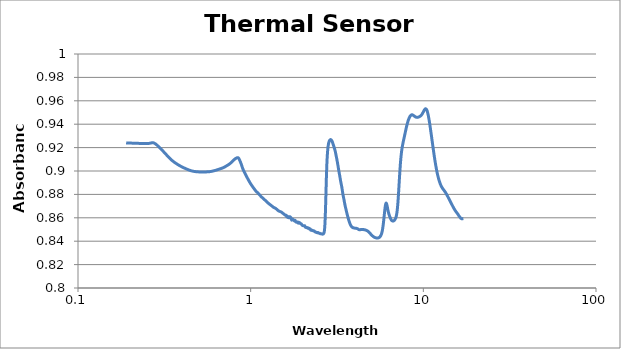
| Category | Absorbance |
|---|---|
| 0.19 | 0.924 |
| 0.25 | 0.923 |
| 0.275 | 0.924 |
| 0.3 | 0.919 |
| 0.325 | 0.914 |
| 0.35 | 0.909 |
| 0.375 | 0.906 |
| 0.4 | 0.904 |
| 0.425 | 0.902 |
| 0.45 | 0.9 |
| 0.475 | 0.9 |
| 0.5 | 0.899 |
| 0.525 | 0.899 |
| 0.55 | 0.899 |
| 0.575 | 0.899 |
| 0.6 | 0.9 |
| 0.625 | 0.901 |
| 0.65 | 0.901 |
| 0.675 | 0.902 |
| 0.7 | 0.903 |
| 0.725 | 0.904 |
| 0.75 | 0.906 |
| 0.775 | 0.907 |
| 0.8 | 0.91 |
| 0.825 | 0.911 |
| 0.85 | 0.911 |
| 0.875 | 0.907 |
| 0.9 | 0.902 |
| 0.925 | 0.898 |
| 0.95 | 0.895 |
| 0.975 | 0.892 |
| 1.0 | 0.889 |
| 1.025 | 0.887 |
| 1.05 | 0.885 |
| 1.075 | 0.883 |
| 1.1 | 0.881 |
| 1.125 | 0.88 |
| 1.15 | 0.878 |
| 1.175 | 0.877 |
| 1.2 | 0.876 |
| 1.225 | 0.874 |
| 1.25 | 0.873 |
| 1.275 | 0.872 |
| 1.3 | 0.871 |
| 1.325 | 0.87 |
| 1.35 | 0.869 |
| 1.375 | 0.869 |
| 1.4 | 0.868 |
| 1.425 | 0.867 |
| 1.45 | 0.866 |
| 1.475 | 0.865 |
| 1.5 | 0.865 |
| 1.525 | 0.864 |
| 1.55 | 0.863 |
| 1.575 | 0.863 |
| 1.6 | 0.862 |
| 1.60418 | 0.862 |
| 1.60816 | 0.862 |
| 1.61216 | 0.862 |
| 1.61618 | 0.861 |
| 1.62022 | 0.861 |
| 1.62428 | 0.861 |
| 1.62836 | 0.861 |
| 1.63246 | 0.861 |
| 1.63659 | 0.861 |
| 1.64073 | 0.861 |
| 1.64489 | 0.861 |
| 1.64908 | 0.86 |
| 1.65329 | 0.86 |
| 1.65751 | 0.86 |
| 1.66176 | 0.86 |
| 1.66604 | 0.86 |
| 1.67033 | 0.86 |
| 1.67465 | 0.86 |
| 1.67899 | 0.86 |
| 1.68335 | 0.861 |
| 1.68773 | 0.861 |
| 1.69214 | 0.861 |
| 1.69657 | 0.86 |
| 1.70102 | 0.86 |
| 1.7055 | 0.86 |
| 1.71 | 0.86 |
| 1.71452 | 0.86 |
| 1.71907 | 0.859 |
| 1.72364 | 0.858 |
| 1.72824 | 0.858 |
| 1.73286 | 0.858 |
| 1.7375 | 0.858 |
| 1.74217 | 0.858 |
| 1.74687 | 0.858 |
| 1.75159 | 0.859 |
| 1.75634 | 0.859 |
| 1.76111 | 0.858 |
| 1.76591 | 0.858 |
| 1.77073 | 0.858 |
| 1.77558 | 0.858 |
| 1.78046 | 0.858 |
| 1.78537 | 0.858 |
| 1.7903 | 0.857 |
| 1.79526 | 0.857 |
| 1.80025 | 0.858 |
| 1.80526 | 0.858 |
| 1.8103 | 0.858 |
| 1.81537 | 0.857 |
| 1.82047 | 0.857 |
| 1.8256 | 0.857 |
| 1.83076 | 0.856 |
| 1.83594 | 0.856 |
| 1.84116 | 0.856 |
| 1.84641 | 0.856 |
| 1.85168 | 0.856 |
| 1.85699 | 0.856 |
| 1.86232 | 0.856 |
| 1.86769 | 0.856 |
| 1.87309 | 0.856 |
| 1.87852 | 0.856 |
| 1.88398 | 0.855 |
| 1.88947 | 0.856 |
| 1.895 | 0.856 |
| 1.90055 | 0.856 |
| 1.90614 | 0.856 |
| 1.91176 | 0.856 |
| 1.91742 | 0.856 |
| 1.92311 | 0.856 |
| 1.92883 | 0.856 |
| 1.93459 | 0.855 |
| 1.94038 | 0.855 |
| 1.94621 | 0.855 |
| 1.95207 | 0.855 |
| 1.95797 | 0.855 |
| 1.9639 | 0.855 |
| 1.96987 | 0.855 |
| 1.97588 | 0.854 |
| 1.98192 | 0.854 |
| 1.988 | 0.854 |
| 1.99412 | 0.854 |
| 2.00027 | 0.853 |
| 2.00647 | 0.853 |
| 2.0127 | 0.853 |
| 2.01897 | 0.853 |
| 2.02528 | 0.853 |
| 2.03162 | 0.853 |
| 2.03801 | 0.853 |
| 2.04444 | 0.853 |
| 2.05091 | 0.853 |
| 2.05742 | 0.853 |
| 2.06398 | 0.853 |
| 2.07057 | 0.852 |
| 2.07721 | 0.852 |
| 2.08389 | 0.852 |
| 2.09061 | 0.852 |
| 2.09737 | 0.852 |
| 2.10418 | 0.852 |
| 2.11104 | 0.852 |
| 2.11794 | 0.852 |
| 2.12488 | 0.852 |
| 2.13187 | 0.852 |
| 2.13891 | 0.851 |
| 2.14599 | 0.851 |
| 2.15312 | 0.851 |
| 2.16029 | 0.851 |
| 2.16752 | 0.851 |
| 2.17479 | 0.851 |
| 2.18212 | 0.851 |
| 2.18949 | 0.85 |
| 2.19691 | 0.85 |
| 2.20438 | 0.851 |
| 2.21191 | 0.85 |
| 2.21948 | 0.85 |
| 2.22711 | 0.849 |
| 2.23479 | 0.849 |
| 2.24252 | 0.85 |
| 2.25031 | 0.85 |
| 2.25815 | 0.849 |
| 2.26604 | 0.849 |
| 2.27399 | 0.849 |
| 2.282 | 0.849 |
| 2.29006 | 0.849 |
| 2.29819 | 0.849 |
| 2.30636 | 0.849 |
| 2.3146 | 0.849 |
| 2.3229 | 0.849 |
| 2.33125 | 0.849 |
| 2.33967 | 0.849 |
| 2.34815 | 0.848 |
| 2.35668 | 0.848 |
| 2.36529 | 0.848 |
| 2.37395 | 0.848 |
| 2.38268 | 0.848 |
| 2.39147 | 0.848 |
| 2.40033 | 0.848 |
| 2.40925 | 0.848 |
| 2.41824 | 0.847 |
| 2.4273 | 0.847 |
| 2.43642 | 0.847 |
| 2.44562 | 0.847 |
| 2.45488 | 0.847 |
| 2.46421 | 0.847 |
| 2.47362 | 0.847 |
| 2.4831 | 0.847 |
| 2.49265 | 0.847 |
| 2.50227 | 0.847 |
| 2.51197 | 0.847 |
| 2.52174 | 0.846 |
| 2.5316 | 0.846 |
| 2.54152 | 0.846 |
| 2.55153 | 0.846 |
| 2.56161 | 0.846 |
| 2.57178 | 0.846 |
| 2.58203 | 0.846 |
| 2.59235 | 0.846 |
| 2.60276 | 0.846 |
| 2.61326 | 0.846 |
| 2.62384 | 0.846 |
| 2.63451 | 0.846 |
| 2.64526 | 0.847 |
| 2.6561 | 0.847 |
| 2.66703 | 0.848 |
| 2.67805 | 0.85 |
| 2.68916 | 0.853 |
| 2.70037 | 0.859 |
| 2.71167 | 0.866 |
| 2.72306 | 0.876 |
| 2.73455 | 0.886 |
| 2.74614 | 0.895 |
| 2.75782 | 0.903 |
| 2.76961 | 0.91 |
| 2.78149 | 0.914 |
| 2.79348 | 0.918 |
| 2.80558 | 0.92 |
| 2.81778 | 0.922 |
| 2.83008 | 0.924 |
| 2.84249 | 0.925 |
| 2.85501 | 0.926 |
| 2.86765 | 0.926 |
| 2.88039 | 0.926 |
| 2.89325 | 0.927 |
| 2.90623 | 0.927 |
| 2.91932 | 0.927 |
| 2.93253 | 0.926 |
| 2.94586 | 0.926 |
| 2.95931 | 0.926 |
| 2.97288 | 0.925 |
| 2.98658 | 0.924 |
| 3.00041 | 0.923 |
| 3.01436 | 0.922 |
| 3.02845 | 0.921 |
| 3.04267 | 0.92 |
| 3.05702 | 0.919 |
| 3.07151 | 0.918 |
| 3.08613 | 0.917 |
| 3.1009 | 0.916 |
| 3.11581 | 0.914 |
| 3.13086 | 0.913 |
| 3.14606 | 0.911 |
| 3.16141 | 0.909 |
| 3.1769 | 0.908 |
| 3.19255 | 0.906 |
| 3.20836 | 0.904 |
| 3.22432 | 0.902 |
| 3.24044 | 0.9 |
| 3.25673 | 0.898 |
| 3.27317 | 0.897 |
| 3.28979 | 0.895 |
| 3.30657 | 0.893 |
| 3.32353 | 0.891 |
| 3.34066 | 0.889 |
| 3.35797 | 0.888 |
| 3.37546 | 0.886 |
| 3.39313 | 0.884 |
| 3.41099 | 0.881 |
| 3.42904 | 0.879 |
| 3.44728 | 0.878 |
| 3.46571 | 0.876 |
| 3.48435 | 0.874 |
| 3.50318 | 0.872 |
| 3.52222 | 0.871 |
| 3.54147 | 0.869 |
| 3.56092 | 0.867 |
| 3.5806 | 0.866 |
| 3.60049 | 0.864 |
| 3.62061 | 0.863 |
| 3.64095 | 0.862 |
| 3.66152 | 0.86 |
| 3.68232 | 0.859 |
| 3.70336 | 0.858 |
| 3.72465 | 0.857 |
| 3.74618 | 0.856 |
| 3.76796 | 0.855 |
| 3.78999 | 0.854 |
| 3.81228 | 0.853 |
| 3.83484 | 0.853 |
| 3.85767 | 0.852 |
| 3.88077 | 0.852 |
| 3.90415 | 0.852 |
| 3.92781 | 0.852 |
| 3.95176 | 0.851 |
| 3.976 | 0.851 |
| 4.00055 | 0.851 |
| 4.02539 | 0.851 |
| 4.05055 | 0.851 |
| 4.07603 | 0.851 |
| 4.10182 | 0.851 |
| 4.12795 | 0.851 |
| 4.15441 | 0.851 |
| 4.18122 | 0.85 |
| 4.20837 | 0.85 |
| 4.23587 | 0.85 |
| 4.26374 | 0.85 |
| 4.29198 | 0.85 |
| 4.32059 | 0.85 |
| 4.34959 | 0.85 |
| 4.37898 | 0.85 |
| 4.40876 | 0.85 |
| 4.43896 | 0.85 |
| 4.46957 | 0.85 |
| 4.50061 | 0.85 |
| 4.53209 | 0.85 |
| 4.564 | 0.85 |
| 4.59637 | 0.85 |
| 4.6292 | 0.85 |
| 4.66251 | 0.849 |
| 4.69629 | 0.849 |
| 4.73057 | 0.849 |
| 4.76536 | 0.849 |
| 4.80065 | 0.848 |
| 4.83648 | 0.848 |
| 4.87284 | 0.847 |
| 4.90976 | 0.847 |
| 4.94724 | 0.846 |
| 4.98529 | 0.846 |
| 5.02394 | 0.845 |
| 5.06319 | 0.845 |
| 5.10306 | 0.844 |
| 5.14356 | 0.844 |
| 5.18471 | 0.843 |
| 5.22652 | 0.843 |
| 5.26901 | 0.843 |
| 5.3122 | 0.843 |
| 5.3561 | 0.843 |
| 5.40074 | 0.843 |
| 5.44612 | 0.843 |
| 5.49227 | 0.843 |
| 5.53922 | 0.843 |
| 5.58697 | 0.844 |
| 5.63555 | 0.844 |
| 5.68499 | 0.845 |
| 5.73529 | 0.847 |
| 5.7865 | 0.849 |
| 5.83863 | 0.853 |
| 5.89171 | 0.857 |
| 5.94576 | 0.863 |
| 6.00082 | 0.868 |
| 6.0569 | 0.872 |
| 6.11404 | 0.872 |
| 6.17227 | 0.87 |
| 6.23162 | 0.867 |
| 6.29212 | 0.864 |
| 6.35381 | 0.862 |
| 6.41672 | 0.86 |
| 6.48088 | 0.859 |
| 6.54635 | 0.858 |
| 6.61315 | 0.857 |
| 6.68132 | 0.857 |
| 6.75092 | 0.857 |
| 6.82198 | 0.858 |
| 6.89456 | 0.859 |
| 6.96869 | 0.861 |
| 7.04444 | 0.865 |
| 7.12185 | 0.873 |
| 7.20098 | 0.883 |
| 7.28189 | 0.895 |
| 7.36464 | 0.906 |
| 7.44929 | 0.914 |
| 7.53591 | 0.92 |
| 7.62457 | 0.924 |
| 7.71534 | 0.927 |
| 7.80829 | 0.931 |
| 7.90352 | 0.935 |
| 8.00109 | 0.938 |
| 8.1011 | 0.941 |
| 8.20365 | 0.944 |
| 8.30882 | 0.946 |
| 8.41673 | 0.947 |
| 8.52748 | 0.948 |
| 8.64118 | 0.948 |
| 8.75795 | 0.948 |
| 8.87792 | 0.947 |
| 9.00123 | 0.946 |
| 9.128 | 0.946 |
| 9.2584 | 0.946 |
| 9.39258 | 0.946 |
| 9.53071 | 0.947 |
| 9.67296 | 0.947 |
| 9.81952 | 0.948 |
| 9.97059 | 0.95 |
| 10.12638 | 0.952 |
| 10.28712 | 0.953 |
| 10.45304 | 0.952 |
| 10.6244 | 0.949 |
| 10.80147 | 0.944 |
| 10.98455 | 0.937 |
| 11.17394 | 0.929 |
| 11.36997 | 0.921 |
| 11.57301 | 0.913 |
| 11.78342 | 0.905 |
| 12.00164 | 0.899 |
| 12.22808 | 0.894 |
| 12.46324 | 0.89 |
| 12.70761 | 0.887 |
| 12.96177 | 0.885 |
| 13.22629 | 0.883 |
| 13.50184 | 0.881 |
| 13.78911 | 0.879 |
| 14.08888 | 0.876 |
| 14.40196 | 0.873 |
| 14.72928 | 0.871 |
| 15.07182 | 0.868 |
| 15.43067 | 0.865 |
| 15.80703 | 0.863 |
| 16.20221 | 0.861 |
| 16.61765 | 0.859 |
| 17.05496 | 0.859 |